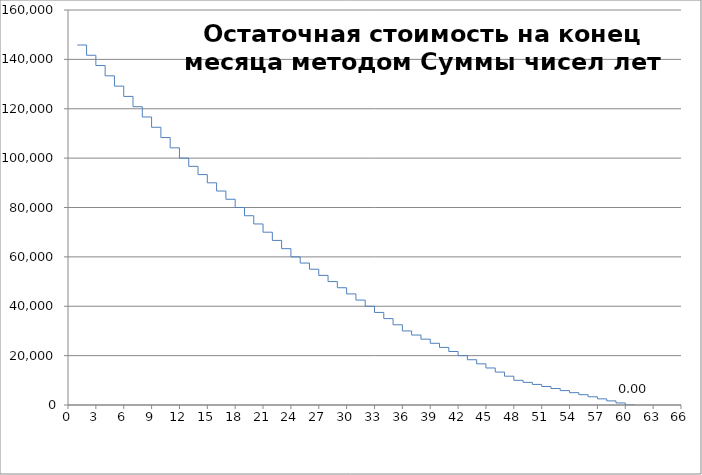
| Category | Остаточная стоимость на конец месяца |
|---|---|
| 1.0 | 145833.333 |
| 2.0 | 145833.333 |
| 2.0 | 141666.667 |
| 3.0 | 141666.667 |
| 3.0 | 137500 |
| 4.0 | 137500 |
| 4.0 | 133333.333 |
| 5.0 | 133333.333 |
| 5.0 | 129166.667 |
| 6.0 | 129166.667 |
| 6.0 | 125000 |
| 7.0 | 125000 |
| 7.0 | 120833.333 |
| 8.0 | 120833.333 |
| 8.0 | 116666.667 |
| 9.0 | 116666.667 |
| 9.0 | 112500 |
| 10.0 | 112500 |
| 10.0 | 108333.333 |
| 11.0 | 108333.333 |
| 11.0 | 104166.667 |
| 12.0 | 104166.667 |
| 12.0 | 100000 |
| 13.0 | 100000 |
| 13.0 | 96666.667 |
| 14.0 | 96666.667 |
| 14.0 | 93333.333 |
| 15.0 | 93333.333 |
| 15.0 | 90000 |
| 16.0 | 90000 |
| 16.0 | 86666.667 |
| 17.0 | 86666.667 |
| 17.0 | 83333.333 |
| 18.0 | 83333.333 |
| 18.0 | 80000 |
| 19.0 | 80000 |
| 19.0 | 76666.667 |
| 20.0 | 76666.667 |
| 20.0 | 73333.333 |
| 21.0 | 73333.333 |
| 21.0 | 70000 |
| 22.0 | 70000 |
| 22.0 | 66666.667 |
| 23.0 | 66666.667 |
| 23.0 | 63333.333 |
| 24.0 | 63333.333 |
| 24.0 | 60000 |
| 25.0 | 60000 |
| 25.0 | 57500 |
| 26.0 | 57500 |
| 26.0 | 55000 |
| 27.0 | 55000 |
| 27.0 | 52500 |
| 28.0 | 52500 |
| 28.0 | 50000 |
| 29.0 | 50000 |
| 29.0 | 47500 |
| 30.0 | 47500 |
| 30.0 | 45000 |
| 31.0 | 45000 |
| 31.0 | 42500 |
| 32.0 | 42500 |
| 32.0 | 40000 |
| 33.0 | 40000 |
| 33.0 | 37500 |
| 34.0 | 37500 |
| 34.0 | 35000 |
| 35.0 | 35000 |
| 35.0 | 32500 |
| 36.0 | 32500 |
| 36.0 | 30000 |
| 37.0 | 30000 |
| 37.0 | 28333.333 |
| 38.0 | 28333.333 |
| 38.0 | 26666.667 |
| 39.0 | 26666.667 |
| 39.0 | 25000 |
| 40.0 | 25000 |
| 40.0 | 23333.333 |
| 41.0 | 23333.333 |
| 41.0 | 21666.667 |
| 42.0 | 21666.667 |
| 42.0 | 20000 |
| 43.0 | 20000 |
| 43.0 | 18333.333 |
| 44.0 | 18333.333 |
| 44.0 | 16666.667 |
| 45.0 | 16666.667 |
| 45.0 | 15000 |
| 46.0 | 15000 |
| 46.0 | 13333.333 |
| 47.0 | 13333.333 |
| 47.0 | 11666.667 |
| 48.0 | 11666.667 |
| 48.0 | 10000 |
| 49.0 | 10000 |
| 49.0 | 9166.667 |
| 50.0 | 9166.667 |
| 50.0 | 8333.333 |
| 51.0 | 8333.333 |
| 51.0 | 7500 |
| 52.0 | 7500 |
| 52.0 | 6666.667 |
| 53.0 | 6666.667 |
| 53.0 | 5833.333 |
| 54.0 | 5833.333 |
| 54.0 | 5000 |
| 55.0 | 5000 |
| 55.0 | 4166.667 |
| 56.0 | 4166.667 |
| 56.0 | 3333.333 |
| 57.0 | 3333.333 |
| 57.0 | 2500 |
| 58.0 | 2500 |
| 58.0 | 1666.667 |
| 59.0 | 1666.667 |
| 59.0 | 833.333 |
| 60.0 | 833.333 |
| 60.0 | 0 |
| 61.0 | 0 |